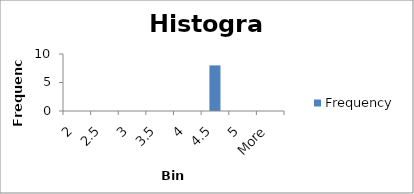
| Category | Frequency |
|---|---|
| 2 | 0 |
| 2.5 | 0 |
| 3 | 0 |
| 3.5 | 0 |
| 4 | 0 |
| 4.5 | 8 |
| 5 | 0 |
| More | 0 |